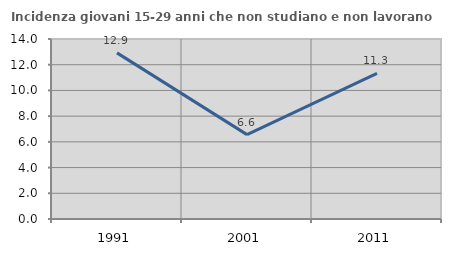
| Category | Incidenza giovani 15-29 anni che non studiano e non lavorano  |
|---|---|
| 1991.0 | 12.92 |
| 2001.0 | 6.562 |
| 2011.0 | 11.321 |